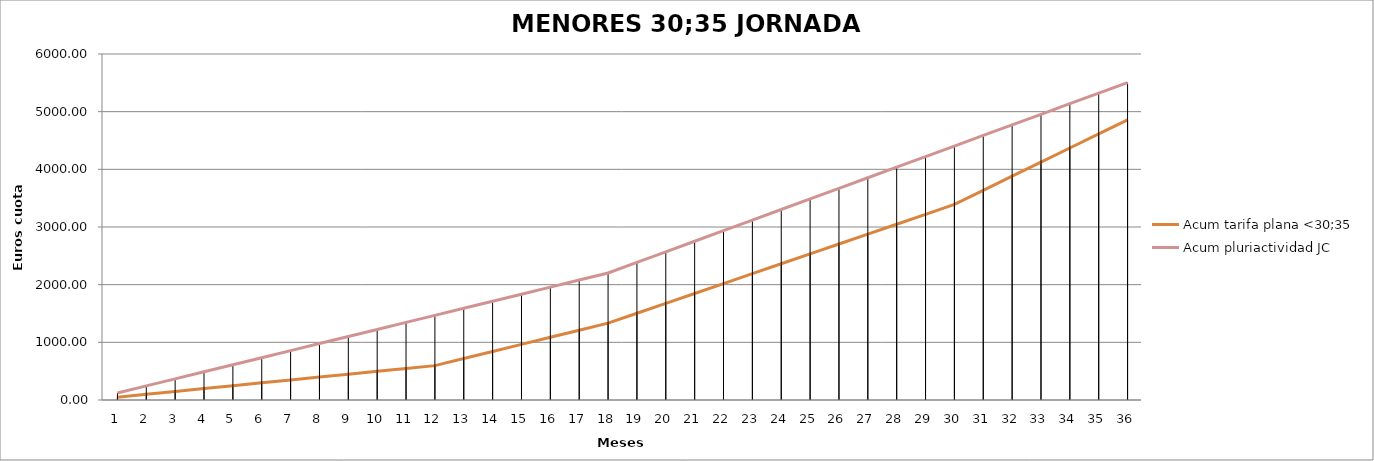
| Category | Acum tarifa plana <30;35 | Acum pluriactividad JC |
|---|---|---|
| 1.0 | 49.669 | 122.333 |
| 2.0 | 99.338 | 244.667 |
| 3.0 | 149.008 | 367 |
| 4.0 | 198.677 | 489.334 |
| 5.0 | 248.346 | 611.667 |
| 6.0 | 298.015 | 734 |
| 7.0 | 347.684 | 856.334 |
| 8.0 | 397.354 | 978.667 |
| 9.0 | 447.023 | 1101.001 |
| 10.0 | 496.692 | 1223.334 |
| 11.0 | 546.361 | 1345.667 |
| 12.0 | 596.03 | 1468.001 |
| 13.0 | 718.824 | 1590.334 |
| 14.0 | 841.617 | 1712.668 |
| 15.0 | 964.41 | 1835.001 |
| 16.0 | 1087.204 | 1957.334 |
| 17.0 | 1209.997 | 2079.668 |
| 18.0 | 1332.79 | 2202.001 |
| 19.0 | 1504.333 | 2385.501 |
| 20.0 | 1675.876 | 2569.001 |
| 21.0 | 1847.418 | 2752.502 |
| 22.0 | 2018.961 | 2936.002 |
| 23.0 | 2190.504 | 3119.502 |
| 24.0 | 2362.046 | 3303.002 |
| 25.0 | 2533.589 | 3486.502 |
| 26.0 | 2705.132 | 3670.002 |
| 27.0 | 2876.674 | 3853.502 |
| 28.0 | 3048.217 | 4037.002 |
| 29.0 | 3219.76 | 4220.502 |
| 30.0 | 3391.303 | 4404.002 |
| 31.0 | 3635.969 | 4587.503 |
| 32.0 | 3880.636 | 4771.003 |
| 33.0 | 4125.303 | 4954.503 |
| 34.0 | 4369.97 | 5138.003 |
| 35.0 | 4614.637 | 5321.503 |
| 36.0 | 4859.303 | 5505.003 |